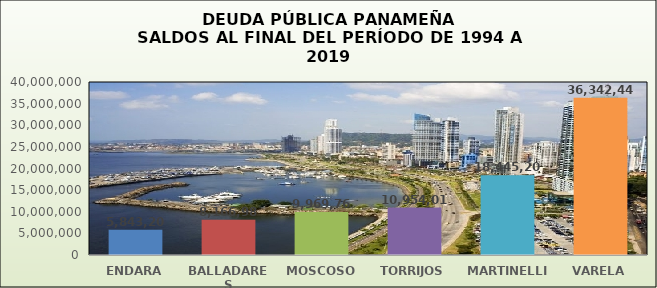
| Category | Series 0 |
|---|---|
| ENDARA | 5843203 |
| BALLADARES | 8166982 |
| MOSCOSO | 9969762 |
| TORRIJOS | 10954013 |
| MARTINELLI | 18445209 |
| VARELA | 36342441 |